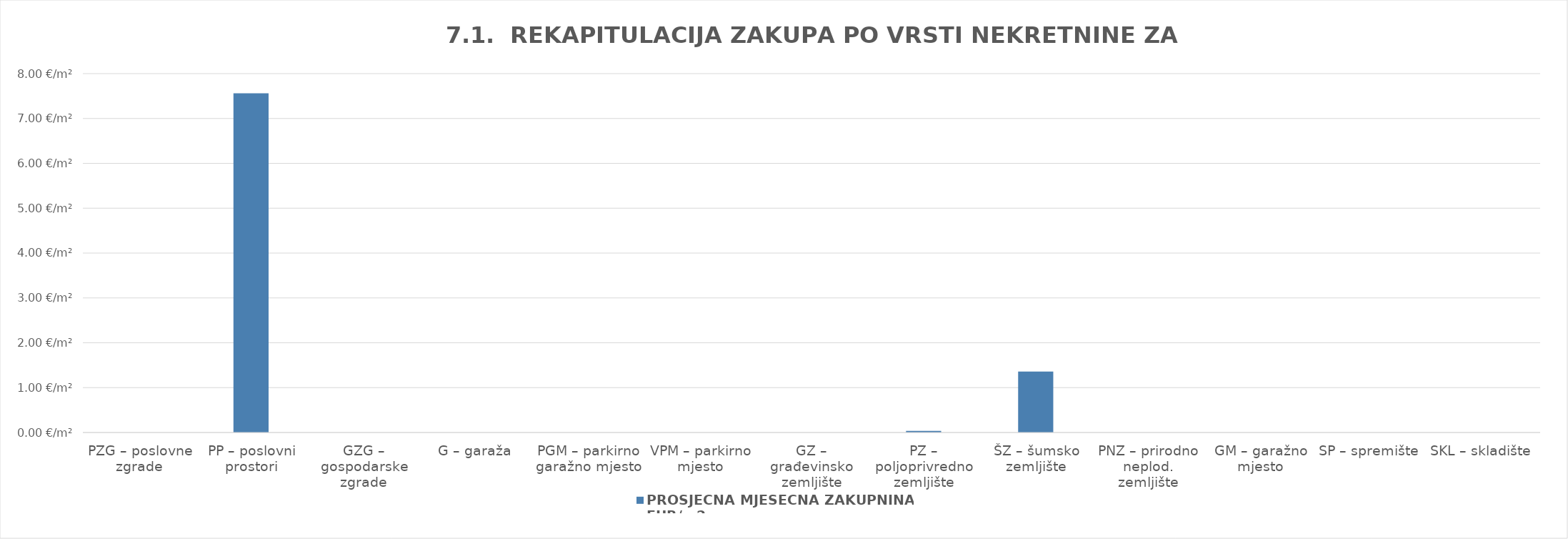
| Category | PROSJEČNA MJESEČNA ZAKUPNINA EUR/m2 |
|---|---|
| PZG – poslovne zgrade | 0 |
| PP – poslovni prostori | 1900-01-07 13:26:39 |
| GZG – gospodarske zgrade | 0 |
| G – garaža | 0 |
| PGM – parkirno garažno mjesto | 0 |
| VPM – parkirno mjesto | 0 |
| GZ – građevinsko zemljište | 0 |
| PZ – poljoprivredno zemljište | 0.036 |
| ŠZ – šumsko zemljište | 1900-01-01 08:35:37 |
| PNZ – prirodno neplod. zemljište | 0 |
| GM – garažno mjesto | 0 |
| SP – spremište  | 0 |
| SKL – skladište  | 0 |